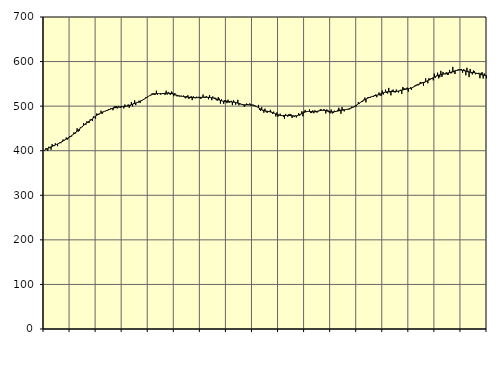
| Category | Piggar | Series 1 |
|---|---|---|
| nan | 399.9 | 401.42 |
| 87.0 | 405.1 | 402.75 |
| 87.0 | 405 | 403.76 |
| 87.0 | 399.7 | 404.89 |
| 87.0 | 408.9 | 406.09 |
| 87.0 | 408.5 | 407.32 |
| 87.0 | 402.1 | 408.55 |
| 87.0 | 414.8 | 409.71 |
| 87.0 | 412 | 410.84 |
| 87.0 | 410.3 | 411.92 |
| 87.0 | 416.6 | 412.97 |
| 87.0 | 414.2 | 414.05 |
| nan | 410.2 | 415.17 |
| 88.0 | 417.1 | 416.34 |
| 88.0 | 418.5 | 417.59 |
| 88.0 | 416.9 | 418.93 |
| 88.0 | 420 | 420.34 |
| 88.0 | 425.1 | 421.78 |
| 88.0 | 421.8 | 423.24 |
| 88.0 | 424.8 | 424.69 |
| 88.0 | 429.6 | 426.1 |
| 88.0 | 424.9 | 427.54 |
| 88.0 | 427.7 | 429.01 |
| 88.0 | 432.8 | 430.55 |
| nan | 430.6 | 432.2 |
| 89.0 | 432.1 | 433.95 |
| 89.0 | 435.6 | 435.78 |
| 89.0 | 441 | 437.72 |
| 89.0 | 437.4 | 439.74 |
| 89.0 | 441.1 | 441.83 |
| 89.0 | 450.3 | 443.98 |
| 89.0 | 442.6 | 446.18 |
| 89.0 | 444.6 | 448.38 |
| 89.0 | 452.4 | 450.57 |
| 89.0 | 452.3 | 452.73 |
| 89.0 | 453 | 454.83 |
| nan | 462.3 | 456.88 |
| 90.0 | 458.7 | 458.85 |
| 90.0 | 457.9 | 460.73 |
| 90.0 | 466 | 462.52 |
| 90.0 | 463.2 | 464.27 |
| 90.0 | 462.2 | 465.98 |
| 90.0 | 470.2 | 467.72 |
| 90.0 | 470.9 | 469.52 |
| 90.0 | 466.6 | 471.44 |
| 90.0 | 476.9 | 473.42 |
| 90.0 | 476 | 475.42 |
| 90.0 | 471.9 | 477.37 |
| nan | 483.3 | 479.21 |
| 91.0 | 482.7 | 480.9 |
| 91.0 | 480.6 | 482.43 |
| 91.0 | 483.7 | 483.79 |
| 91.0 | 489.8 | 485.02 |
| 91.0 | 482.4 | 486.17 |
| 91.0 | 486.3 | 487.23 |
| 91.0 | 488.2 | 488.18 |
| 91.0 | 488.6 | 489.1 |
| 91.0 | 490.9 | 489.99 |
| 91.0 | 489.8 | 490.88 |
| 91.0 | 493.6 | 491.8 |
| nan | 492 | 492.74 |
| 92.0 | 495.3 | 493.64 |
| 92.0 | 494.7 | 494.51 |
| 92.0 | 490.9 | 495.31 |
| 92.0 | 498.7 | 496.01 |
| 92.0 | 499.8 | 496.59 |
| 92.0 | 500.2 | 497.08 |
| 92.0 | 494.8 | 497.49 |
| 92.0 | 500.5 | 497.85 |
| 92.0 | 497.2 | 498.12 |
| 92.0 | 496.4 | 498.36 |
| 92.0 | 499.7 | 498.56 |
| nan | 498.5 | 498.74 |
| 93.0 | 495 | 498.96 |
| 93.0 | 503.6 | 499.28 |
| 93.0 | 500.2 | 499.74 |
| 93.0 | 499.5 | 500.33 |
| 93.0 | 503.8 | 501.02 |
| 93.0 | 496.4 | 501.78 |
| 93.0 | 500.7 | 502.58 |
| 93.0 | 509.2 | 503.43 |
| 93.0 | 499.4 | 504.27 |
| 93.0 | 506.6 | 505.13 |
| 93.0 | 512.9 | 505.98 |
| nan | 502.3 | 506.86 |
| 94.0 | 507.3 | 507.76 |
| 94.0 | 507.9 | 508.7 |
| 94.0 | 512.2 | 509.68 |
| 94.0 | 506.9 | 510.75 |
| 94.0 | 513.1 | 511.92 |
| 94.0 | 512.8 | 513.23 |
| 94.0 | 515.6 | 514.71 |
| 94.0 | 515.8 | 516.26 |
| 94.0 | 519.3 | 517.84 |
| 94.0 | 518.2 | 519.44 |
| 94.0 | 520.2 | 521 |
| nan | 522.5 | 522.48 |
| 95.0 | 524.1 | 523.87 |
| 95.0 | 524.5 | 525.12 |
| 95.0 | 528.3 | 526.16 |
| 95.0 | 528.6 | 526.98 |
| 95.0 | 525.1 | 527.57 |
| 95.0 | 525.7 | 527.92 |
| 95.0 | 534.7 | 528.08 |
| 95.0 | 525.8 | 528.11 |
| 95.0 | 527.7 | 528.09 |
| 95.0 | 528.3 | 528.05 |
| 95.0 | 525.8 | 528.04 |
| nan | 527.9 | 528.1 |
| 96.0 | 529.1 | 528.23 |
| 96.0 | 529.2 | 528.42 |
| 96.0 | 525.1 | 528.64 |
| 96.0 | 534.6 | 528.86 |
| 96.0 | 526 | 529.02 |
| 96.0 | 531.8 | 529.07 |
| 96.0 | 526.7 | 528.95 |
| 96.0 | 525.4 | 528.6 |
| 96.0 | 532.8 | 528.08 |
| 96.0 | 530.2 | 527.41 |
| 96.0 | 522.3 | 526.66 |
| nan | 529.3 | 525.89 |
| 97.0 | 524.4 | 525.1 |
| 97.0 | 521.8 | 524.34 |
| 97.0 | 524 | 523.66 |
| 97.0 | 521.5 | 523.06 |
| 97.0 | 522.9 | 522.56 |
| 97.0 | 523.4 | 522.16 |
| 97.0 | 521.9 | 521.81 |
| 97.0 | 523.8 | 521.52 |
| 97.0 | 519.6 | 521.22 |
| 97.0 | 517.5 | 520.88 |
| 97.0 | 522.5 | 520.52 |
| nan | 524.4 | 520.16 |
| 98.0 | 516 | 519.84 |
| 98.0 | 519.4 | 519.57 |
| 98.0 | 522.4 | 519.34 |
| 98.0 | 513.5 | 519.14 |
| 98.0 | 522 | 519.01 |
| 98.0 | 520.1 | 518.92 |
| 98.0 | 517.8 | 518.89 |
| 98.0 | 521.2 | 518.96 |
| 98.0 | 519.5 | 519.08 |
| 98.0 | 521 | 519.26 |
| 98.0 | 517.9 | 519.47 |
| nan | 516.1 | 519.68 |
| 99.0 | 519.8 | 519.85 |
| 99.0 | 525.9 | 520 |
| 99.0 | 518.9 | 520.09 |
| 99.0 | 518.2 | 520.14 |
| 99.0 | 522.5 | 520.13 |
| 99.0 | 519.1 | 519.99 |
| 99.0 | 515.4 | 519.78 |
| 99.0 | 524.8 | 519.51 |
| 99.0 | 519.9 | 519.17 |
| 99.0 | 513.3 | 518.78 |
| 99.0 | 521.7 | 518.33 |
| nan | 517.9 | 517.79 |
| 0.0 | 519.1 | 517.15 |
| 0.0 | 514.3 | 516.37 |
| 0.0 | 512.1 | 515.48 |
| 0.0 | 520.1 | 514.55 |
| 0.0 | 516.9 | 513.63 |
| 0.0 | 505.7 | 512.78 |
| 0.0 | 515.2 | 512.06 |
| 0.0 | 511.2 | 511.46 |
| 0.0 | 505.3 | 510.99 |
| 0.0 | 513.1 | 510.67 |
| 0.0 | 513.1 | 510.43 |
| nan | 506.8 | 510.24 |
| 1.0 | 514.5 | 510.08 |
| 1.0 | 507.7 | 509.92 |
| 1.0 | 511.1 | 509.75 |
| 1.0 | 511.8 | 509.53 |
| 1.0 | 502.2 | 509.25 |
| 1.0 | 513 | 508.92 |
| 1.0 | 509.9 | 508.53 |
| 1.0 | 503.3 | 508.02 |
| 1.0 | 508.1 | 507.4 |
| 1.0 | 514.1 | 506.69 |
| 1.0 | 502 | 505.9 |
| nan | 506.3 | 505.11 |
| 2.0 | 504.2 | 504.38 |
| 2.0 | 504.2 | 503.75 |
| 2.0 | 502.1 | 503.29 |
| 2.0 | 498.3 | 503 |
| 2.0 | 501.5 | 502.9 |
| 2.0 | 505.9 | 502.92 |
| 2.0 | 504.8 | 502.99 |
| 2.0 | 502.2 | 503.09 |
| 2.0 | 506.1 | 503.13 |
| 2.0 | 501.1 | 502.99 |
| 2.0 | 502.1 | 502.64 |
| nan | 503.4 | 502.08 |
| 3.0 | 499.9 | 501.28 |
| 3.0 | 501.1 | 500.28 |
| 3.0 | 498.4 | 499.13 |
| 3.0 | 497.8 | 497.86 |
| 3.0 | 502.8 | 496.51 |
| 3.0 | 491.6 | 495.1 |
| 3.0 | 489.1 | 493.71 |
| 3.0 | 497.5 | 492.41 |
| 3.0 | 490 | 491.26 |
| 3.0 | 485.3 | 490.31 |
| 3.0 | 494.3 | 489.57 |
| nan | 487.8 | 489.01 |
| 4.0 | 484.8 | 488.54 |
| 4.0 | 488.9 | 488.09 |
| 4.0 | 488.4 | 487.58 |
| 4.0 | 491.7 | 486.96 |
| 4.0 | 487.3 | 486.2 |
| 4.0 | 482.5 | 485.34 |
| 4.0 | 487.7 | 484.4 |
| 4.0 | 483.5 | 483.39 |
| 4.0 | 476.8 | 482.38 |
| 4.0 | 485.8 | 481.43 |
| 4.0 | 476.5 | 480.59 |
| nan | 480.5 | 479.86 |
| 5.0 | 483 | 479.35 |
| 5.0 | 478.2 | 479.05 |
| 5.0 | 478.8 | 478.94 |
| 5.0 | 476 | 478.95 |
| 5.0 | 471.6 | 479.05 |
| 5.0 | 482.5 | 479.19 |
| 5.0 | 479.1 | 479.28 |
| 5.0 | 476.4 | 479.26 |
| 5.0 | 481.7 | 479.14 |
| 5.0 | 482.6 | 478.91 |
| 5.0 | 481.4 | 478.6 |
| nan | 473.5 | 478.29 |
| 6.0 | 479.1 | 478 |
| 6.0 | 475.5 | 477.82 |
| 6.0 | 479.1 | 477.86 |
| 6.0 | 474.7 | 478.2 |
| 6.0 | 477.8 | 478.84 |
| 6.0 | 484.1 | 479.76 |
| 6.0 | 478.8 | 480.93 |
| 6.0 | 481.2 | 482.26 |
| 6.0 | 488.5 | 483.63 |
| 6.0 | 477.2 | 484.89 |
| 6.0 | 487.9 | 485.97 |
| nan | 491.5 | 486.84 |
| 7.0 | 486.9 | 487.49 |
| 7.0 | 487.6 | 487.89 |
| 7.0 | 487.6 | 488.04 |
| 7.0 | 492.7 | 487.99 |
| 7.0 | 484.8 | 487.81 |
| 7.0 | 484.5 | 487.57 |
| 7.0 | 490.3 | 487.37 |
| 7.0 | 484.1 | 487.34 |
| 7.0 | 490.7 | 487.52 |
| 7.0 | 486.6 | 487.88 |
| 7.0 | 485.5 | 488.42 |
| nan | 488.4 | 489.04 |
| 8.0 | 488.9 | 489.65 |
| 8.0 | 493.2 | 490.19 |
| 8.0 | 492.3 | 490.57 |
| 8.0 | 490.3 | 490.74 |
| 8.0 | 492.6 | 490.65 |
| 8.0 | 492.3 | 490.33 |
| 8.0 | 483.6 | 489.84 |
| 8.0 | 492.5 | 489.21 |
| 8.0 | 490.9 | 488.55 |
| 8.0 | 486.1 | 487.95 |
| 8.0 | 483.8 | 487.5 |
| nan | 492.4 | 487.21 |
| 9.0 | 483.5 | 487.12 |
| 9.0 | 484.9 | 487.22 |
| 9.0 | 489.8 | 487.48 |
| 9.0 | 488.9 | 487.87 |
| 9.0 | 489.1 | 488.37 |
| 9.0 | 491.7 | 488.93 |
| 9.0 | 496.3 | 489.51 |
| 9.0 | 492.5 | 490.06 |
| 9.0 | 483 | 490.52 |
| 9.0 | 497.8 | 490.92 |
| 9.0 | 493 | 491.31 |
| nan | 488.2 | 491.7 |
| 10.0 | 492.9 | 492.12 |
| 10.0 | 493 | 492.58 |
| 10.0 | 492.5 | 493.1 |
| 10.0 | 492.8 | 493.69 |
| 10.0 | 492.9 | 494.39 |
| 10.0 | 496.2 | 495.25 |
| 10.0 | 499 | 496.27 |
| 10.0 | 497.1 | 497.41 |
| 10.0 | 497.7 | 498.73 |
| 10.0 | 499.6 | 500.22 |
| 10.0 | 499.1 | 501.79 |
| nan | 503.3 | 503.43 |
| 11.0 | 509 | 505.13 |
| 11.0 | 505.5 | 506.84 |
| 11.0 | 508.2 | 508.53 |
| 11.0 | 511.5 | 510.17 |
| 11.0 | 510 | 511.75 |
| 11.0 | 514.6 | 513.23 |
| 11.0 | 519.2 | 514.6 |
| 11.0 | 508.5 | 515.88 |
| 11.0 | 517.3 | 517.08 |
| 11.0 | 520.5 | 518.2 |
| 11.0 | 520.1 | 519.28 |
| nan | 518.4 | 520.26 |
| 12.0 | 521.3 | 521.14 |
| 12.0 | 522.7 | 521.92 |
| 12.0 | 520.8 | 522.61 |
| 12.0 | 524.9 | 523.23 |
| 12.0 | 526.2 | 523.87 |
| 12.0 | 520 | 524.51 |
| 12.0 | 524.9 | 525.21 |
| 12.0 | 530.7 | 526.04 |
| 12.0 | 523.8 | 527.01 |
| 12.0 | 523.2 | 528.02 |
| 12.0 | 535 | 529.01 |
| nan | 526.1 | 529.95 |
| 13.0 | 531.3 | 530.78 |
| 13.0 | 537 | 531.45 |
| 13.0 | 530.1 | 531.97 |
| 13.0 | 528.3 | 532.34 |
| 13.0 | 540.9 | 532.56 |
| 13.0 | 531.1 | 532.71 |
| 13.0 | 524.2 | 532.78 |
| 13.0 | 535.2 | 532.78 |
| 13.0 | 537 | 532.75 |
| 13.0 | 531.3 | 532.77 |
| 13.0 | 530.6 | 532.86 |
| nan | 537.2 | 533.07 |
| 14.0 | 533.8 | 533.44 |
| 14.0 | 530.7 | 533.93 |
| 14.0 | 533.7 | 534.51 |
| 14.0 | 536.7 | 535.18 |
| 14.0 | 527.5 | 535.87 |
| 14.0 | 543 | 536.5 |
| 14.0 | 540.6 | 537.1 |
| 14.0 | 536.5 | 537.62 |
| 14.0 | 540 | 538.06 |
| 14.0 | 541.5 | 538.46 |
| 14.0 | 532.4 | 538.89 |
| nan | 539.3 | 539.38 |
| 15.0 | 542.1 | 540 |
| 15.0 | 536.7 | 540.85 |
| 15.0 | 542.5 | 541.96 |
| 15.0 | 542.8 | 543.25 |
| 15.0 | 546.1 | 544.63 |
| 15.0 | 547.6 | 546.06 |
| 15.0 | 548.2 | 547.38 |
| 15.0 | 546.4 | 548.57 |
| 15.0 | 548.5 | 549.62 |
| 15.0 | 554.3 | 550.54 |
| 15.0 | 552.8 | 551.41 |
| nan | 553.5 | 552.25 |
| 16.0 | 545.7 | 553.08 |
| 16.0 | 552.3 | 553.96 |
| 16.0 | 562.5 | 554.89 |
| 16.0 | 555.4 | 555.93 |
| 16.0 | 551.3 | 557.12 |
| 16.0 | 562.6 | 558.41 |
| 16.0 | 558.5 | 559.78 |
| 16.0 | 562.2 | 561.19 |
| 16.0 | 561.9 | 562.59 |
| 16.0 | 557.9 | 563.93 |
| 16.0 | 572.8 | 565.18 |
| nan | 563.7 | 566.36 |
| 17.0 | 568.7 | 567.49 |
| 17.0 | 575.1 | 568.53 |
| 17.0 | 562.4 | 569.42 |
| 17.0 | 565 | 570.16 |
| 17.0 | 579.2 | 570.76 |
| 17.0 | 565.4 | 571.27 |
| 17.0 | 576.7 | 571.75 |
| 17.0 | 572.4 | 572.27 |
| 17.0 | 571.2 | 572.83 |
| 17.0 | 576.1 | 573.44 |
| 17.0 | 570 | 574.08 |
| nan | 570.6 | 574.7 |
| 18.0 | 581.4 | 575.34 |
| 18.0 | 573.7 | 576.04 |
| 18.0 | 573.9 | 576.79 |
| 18.0 | 588.1 | 577.61 |
| 18.0 | 576 | 578.47 |
| 18.0 | 572 | 579.24 |
| 18.0 | 579.9 | 579.9 |
| 18.0 | 581.1 | 580.43 |
| 18.0 | 582.5 | 580.8 |
| 18.0 | 582.4 | 580.99 |
| 18.0 | 582.4 | 581.01 |
| nan | 583.2 | 580.84 |
| 19.0 | 574.9 | 580.43 |
| 19.0 | 582.7 | 579.83 |
| 19.0 | 581.5 | 579.12 |
| 19.0 | 569.2 | 578.36 |
| 19.0 | 586.1 | 577.6 |
| 19.0 | 579.4 | 577 |
| 19.0 | 565.1 | 576.56 |
| 19.0 | 583.5 | 576.19 |
| 19.0 | 573.9 | 575.88 |
| 19.0 | 571.2 | 575.56 |
| 19.0 | 580 | 575.19 |
| nan | 578 | 574.78 |
| 20.0 | 571.3 | 574.31 |
| 20.0 | 574.3 | 573.74 |
| 20.0 | 574.2 | 573.08 |
| 20.0 | 574.9 | 572.36 |
| 20.0 | 562.6 | 571.6 |
| 20.0 | 574.6 | 570.82 |
| 20.0 | 576.2 | 570.13 |
| 20.0 | 562 | 569.56 |
| 20.0 | 573.4 | 569.11 |
| 20.0 | 570 | 568.81 |
| 20.0 | 562.3 | 568.66 |